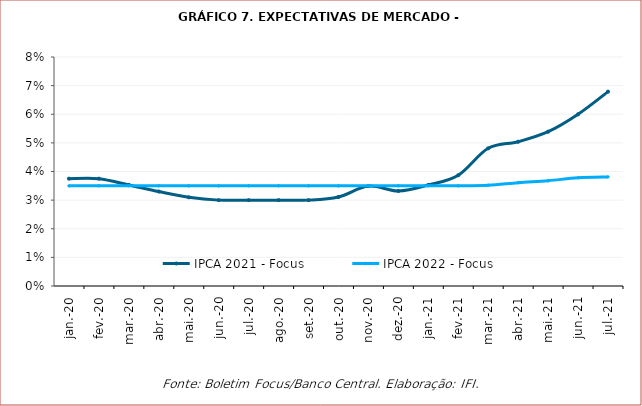
| Category | IPCA 2021 - Focus | IPCA 2022 - Focus |
|---|---|---|
| 2020-01-28 | 0.038 | 0.035 |
| 2020-02-28 | 0.038 | 0.035 |
| 2020-03-28 | 0.035 | 0.035 |
| 2020-04-28 | 0.033 | 0.035 |
| 2020-05-28 | 0.031 | 0.035 |
| 2020-06-28 | 0.03 | 0.035 |
| 2020-07-28 | 0.03 | 0.035 |
| 2020-08-28 | 0.03 | 0.035 |
| 2020-09-28 | 0.03 | 0.035 |
| 2020-10-28 | 0.031 | 0.035 |
| 2020-11-28 | 0.035 | 0.035 |
| 2020-12-28 | 0.033 | 0.035 |
| 2021-01-28 | 0.035 | 0.035 |
| 2021-02-28 | 0.039 | 0.035 |
| 2021-03-28 | 0.048 | 0.035 |
| 2021-04-28 | 0.05 | 0.036 |
| 2021-05-28 | 0.054 | 0.037 |
| 2021-06-28 | 0.06 | 0.038 |
| 2021-07-28 | 0.068 | 0.038 |